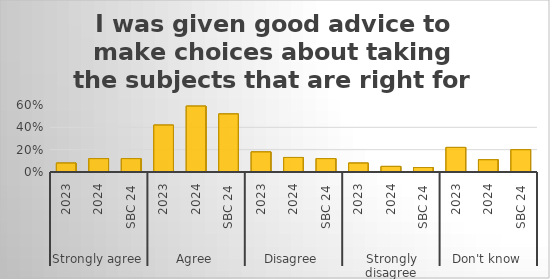
| Category | I was given good advice to make choices about taking the subjects that are right for me. |
|---|---|
| 0 | 0.08 |
| 1 | 0.12 |
| 2 | 0.12 |
| 3 | 0.42 |
| 4 | 0.59 |
| 5 | 0.52 |
| 6 | 0.18 |
| 7 | 0.13 |
| 8 | 0.12 |
| 9 | 0.08 |
| 10 | 0.05 |
| 11 | 0.04 |
| 12 | 0.22 |
| 13 | 0.11 |
| 14 | 0.2 |